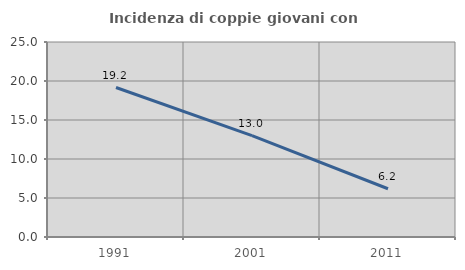
| Category | Incidenza di coppie giovani con figli |
|---|---|
| 1991.0 | 19.164 |
| 2001.0 | 12.987 |
| 2011.0 | 6.186 |